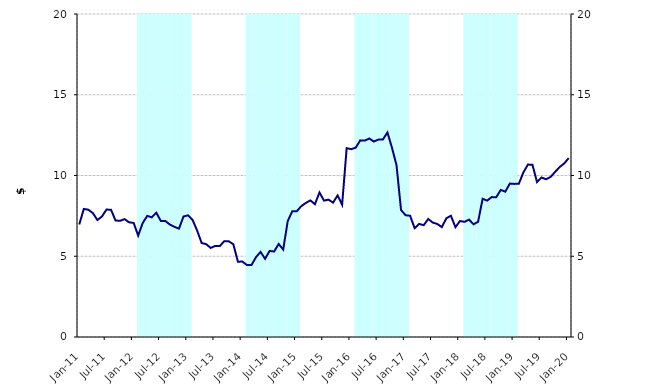
| Category | Series 1 |
|---|---|
| 0 | 0 |
| 1900-01-01 | 0 |
| 1900-01-02 | 0 |
| 1900-01-03 | 0 |
| 1900-01-04 | 0 |
| 1900-01-05 | 0 |
| 1900-01-06 | 0 |
| 1900-01-07 | 0 |
| 1900-01-08 | 0 |
| 1900-01-09 | 0 |
| 1900-01-10 | 0 |
| 1900-01-11 | 0 |
| 1900-01-12 | 0 |
| 1900-01-13 | 20000000 |
| 1900-01-14 | 20000000 |
| 1900-01-15 | 20000000 |
| 1900-01-16 | 20000000 |
| 1900-01-17 | 20000000 |
| 1900-01-18 | 20000000 |
| 1900-01-19 | 20000000 |
| 1900-01-20 | 20000000 |
| 1900-01-21 | 20000000 |
| 1900-01-22 | 20000000 |
| 1900-01-23 | 20000000 |
| 1900-01-24 | 20000000 |
| 1900-01-25 | 0 |
| 1900-01-26 | 0 |
| 1900-01-27 | 0 |
| 1900-01-28 | 0 |
| 1900-01-29 | 0 |
| 1900-01-30 | 0 |
| 1900-01-31 | 0 |
| 1900-02-01 | 0 |
| 1900-02-02 | 0 |
| 1900-02-03 | 0 |
| 1900-02-04 | 0 |
| 1900-02-05 | 0 |
| 1900-02-06 | 20000000 |
| 1900-02-07 | 20000000 |
| 1900-02-08 | 20000000 |
| 1900-02-09 | 20000000 |
| 1900-02-10 | 20000000 |
| 1900-02-11 | 20000000 |
| 1900-02-12 | 20000000 |
| 1900-02-13 | 20000000 |
| 1900-02-14 | 20000000 |
| 1900-02-15 | 20000000 |
| 1900-02-16 | 20000000 |
| 1900-02-17 | 20000000 |
| 1900-02-18 | 0 |
| 1900-02-19 | 0 |
| 1900-02-20 | 0 |
| 1900-02-21 | 0 |
| 1900-02-22 | 0 |
| 1900-02-23 | 0 |
| 1900-02-24 | 0 |
| 1900-02-25 | 0 |
| 1900-02-26 | 0 |
| 1900-02-27 | 0 |
| 1900-02-28 | 0 |
| 1900-02-28 | 0 |
| 1900-03-01 | 20000000 |
| 1900-03-02 | 20000000 |
| 1900-03-03 | 20000000 |
| 1900-03-04 | 20000000 |
| 1900-03-05 | 20000000 |
| 1900-03-06 | 20000000 |
| 1900-03-07 | 20000000 |
| 1900-03-08 | 20000000 |
| 1900-03-09 | 20000000 |
| 1900-03-10 | 20000000 |
| 1900-03-11 | 20000000 |
| 1900-03-12 | 20000000 |
| 1900-03-13 | 0 |
| 1900-03-14 | 0 |
| 1900-03-15 | 0 |
| 1900-03-16 | 0 |
| 1900-03-17 | 0 |
| 1900-03-18 | 0 |
| 1900-03-19 | 0 |
| 1900-03-20 | 0 |
| 1900-03-21 | 0 |
| 1900-03-22 | 0 |
| 1900-03-23 | 0 |
| 1900-03-24 | 0 |
| 1900-03-25 | 20000000 |
| 1900-03-26 | 20000000 |
| 1900-03-27 | 20000000 |
| 1900-03-28 | 20000000 |
| 1900-03-29 | 20000000 |
| 1900-03-30 | 20000000 |
| 1900-03-31 | 20000000 |
| 1900-04-01 | 20000000 |
| 1900-04-02 | 20000000 |
| 1900-04-03 | 20000000 |
| 1900-04-04 | 20000000 |
| 1900-04-05 | 20000000 |
| 1900-04-06 | 0 |
| 1900-04-07 | 0 |
| 1900-04-08 | 0 |
| 1900-04-09 | 0 |
| 1900-04-10 | 0 |
| 1900-04-11 | 0 |
| 1900-04-12 | 0 |
| 1900-04-13 | 0 |
| 1900-04-14 | 0 |
| 1900-04-15 | 0 |
| 1900-04-16 | 0 |
| 1900-04-17 | 0 |